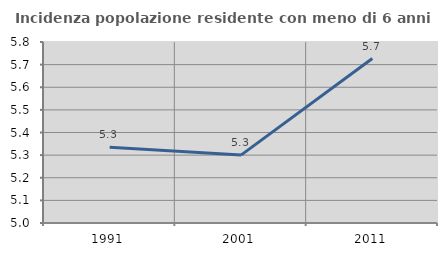
| Category | Incidenza popolazione residente con meno di 6 anni |
|---|---|
| 1991.0 | 5.335 |
| 2001.0 | 5.3 |
| 2011.0 | 5.727 |